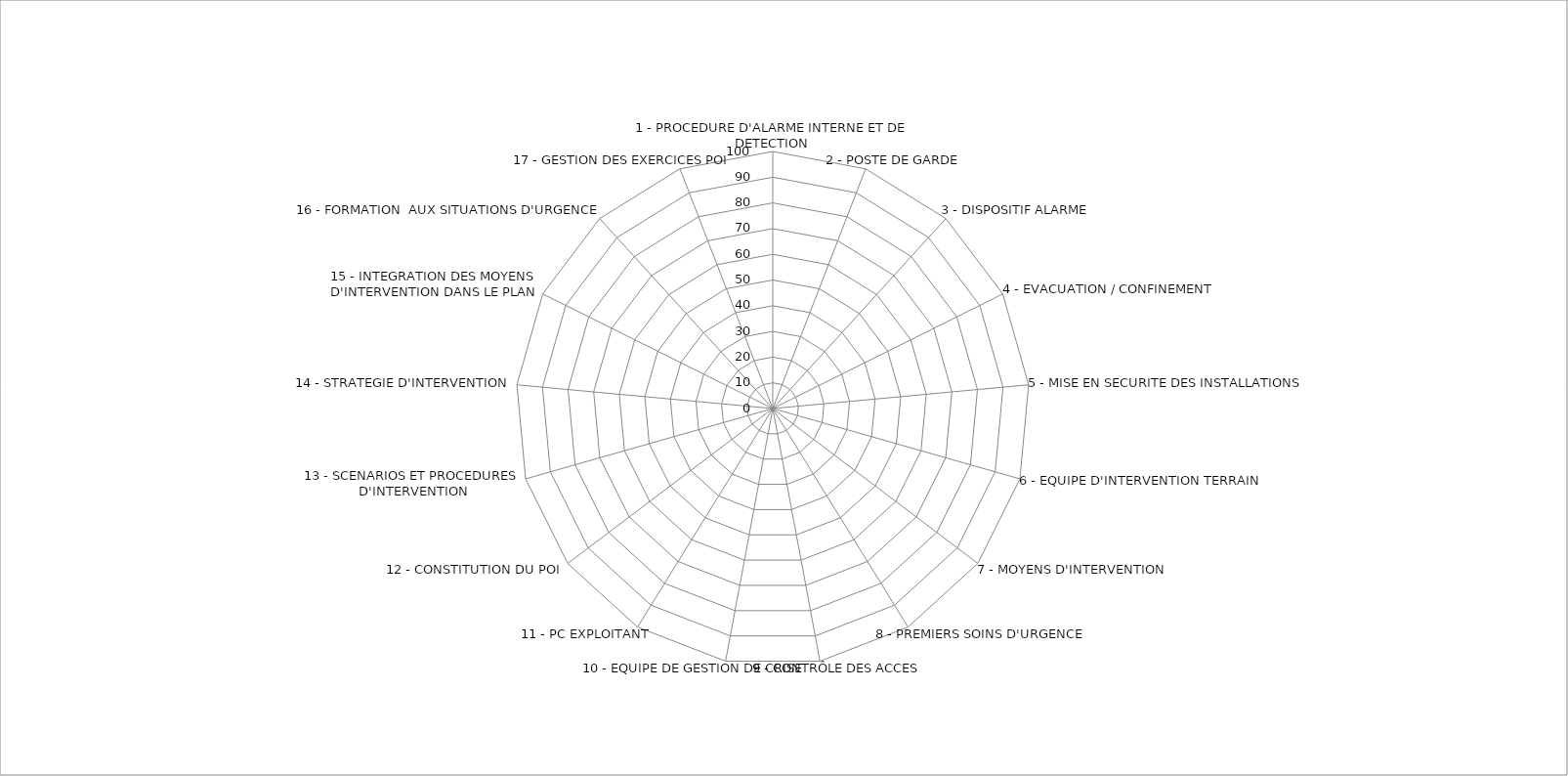
| Category | 0 |
|---|---|
|  1 - PROCEDURE D'ALARME INTERNE ET DE DETECTION | 0 |
| 2 - POSTE DE GARDE   | 0 |
| 3 - DISPOSITIF ALARME | 0 |
| 4 - EVACUATION / CONFINEMENT | 0 |
| 5 - MISE EN SECURITE DES INSTALLATIONS | 0 |
| 6 - EQUIPE D'INTERVENTION TERRAIN | 0 |
| 7 - MOYENS D'INTERVENTION | 0 |
| 8 - PREMIERS SOINS D'URGENCE | 0 |
| 9 - CONTRÔLE DES ACCES | 0 |
| 10 - EQUIPE DE GESTION DE CRISE | 0 |
| 11 - PC EXPLOITANT | 0 |
| 12 - CONSTITUTION DU POI | 0 |
| 13 - SCENARIOS ET PROCEDURES D'INTERVENTION | 0 |
| 14 - STRATEGIE D'INTERVENTION | 0 |
| 15 - INTEGRATION DES MOYENS D'INTERVENTION DANS LE PLAN | 0 |
| 16 - FORMATION  AUX SITUATIONS D'URGENCE | 0 |
| 17 - GESTION DES EXERCICES POI | 0 |